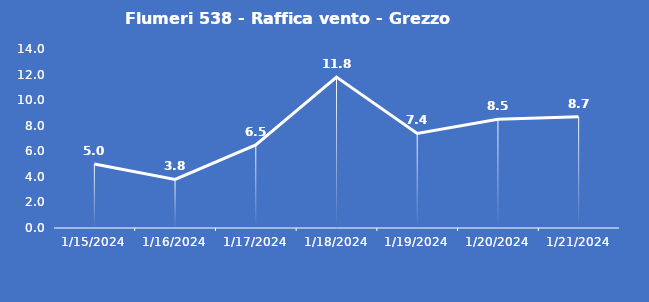
| Category | Flumeri 538 - Raffica vento - Grezzo (m/s) |
|---|---|
| 1/15/24 | 5 |
| 1/16/24 | 3.8 |
| 1/17/24 | 6.5 |
| 1/18/24 | 11.8 |
| 1/19/24 | 7.4 |
| 1/20/24 | 8.5 |
| 1/21/24 | 8.7 |